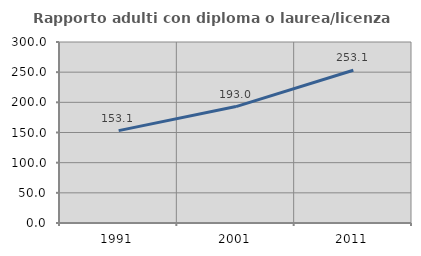
| Category | Rapporto adulti con diploma o laurea/licenza media  |
|---|---|
| 1991.0 | 153.111 |
| 2001.0 | 192.953 |
| 2011.0 | 253.146 |